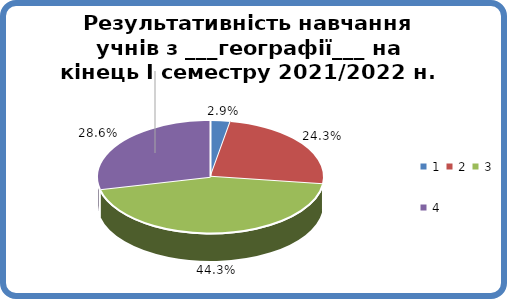
| Category | Series 0 |
|---|---|
| 0 | 0.029 |
| 1 | 0.243 |
| 2 | 0.443 |
| 3 | 0.286 |